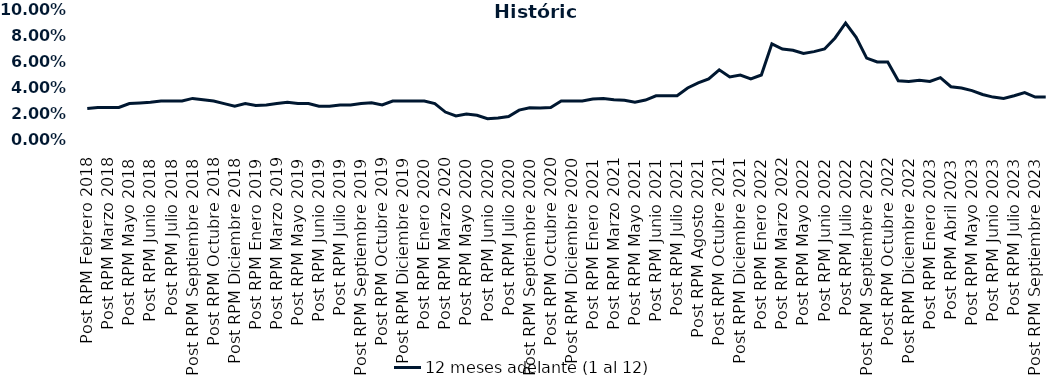
| Category | 12 meses adelante (1 al 12)  |
|---|---|
| Post RPM Febrero 2018 | 0.024 |
| Pre RPM Marzo 2018 | 0.025 |
| Post RPM Marzo 2018 | 0.025 |
| Pre RPM Mayo 2018 | 0.025 |
| Post RPM Mayo 2018 | 0.028 |
| Pre RPM Junio 2018 | 0.028 |
| Post RPM Junio 2018 | 0.029 |
| Pre RPM Julio 2018 | 0.03 |
| Post RPM Julio 2018 | 0.03 |
| Pre RPM Septiembre 2018 | 0.03 |
| Post RPM Septiembre 2018 | 0.032 |
| Pre RPM Octubre 2018 | 0.031 |
| Post RPM Octubre 2018 | 0.03 |
| Pre RPM Diciembre 2018 | 0.028 |
| Post RPM Diciembre 2018 | 0.026 |
| Pre RPM Enero 2019 | 0.028 |
| Post RPM Enero 2019 | 0.026 |
| Pre RPM Marzo 2019 | 0.027 |
| Post RPM Marzo 2019 | 0.028 |
| Pre RPM Mayo 2019 | 0.029 |
| Post RPM Mayo 2019 | 0.028 |
| Pre RPM Junio 2019 | 0.028 |
| Post RPM Junio 2019 | 0.026 |
| Pre RPM Julio 2019 | 0.026 |
| Post RPM Julio 2019 | 0.027 |
| Pre RPM Septiembre 2019 | 0.027 |
| Post RPM Septiembre 2019 | 0.028 |
| Pre RPM Octubre 2019 | 0.029 |
| Post RPM Octubre 2019 | 0.027 |
| Pre RPM Diciembre 2019 | 0.03 |
| Post RPM Diciembre 2019 | 0.03 |
| Pre RPM Enero 2020 | 0.03 |
| Post RPM Enero 2020 | 0.03 |
| Pre RPM Marzo 2020 | 0.028 |
| Post RPM Marzo 2020 | 0.022 |
| Pre RPM Mayo 2020 | 0.018 |
| Post RPM Mayo 2020 | 0.02 |
| Pre RPM Junio 2020 | 0.019 |
| Post RPM Junio 2020 | 0.016 |
| Pre RPM Julio 2020 | 0.017 |
| Post RPM Julio 2020 | 0.018 |
| Pre RPM Septiembre 2020 | 0.023 |
| Post RPM Septiembre 2020 | 0.025 |
| Pre RPM Octubre 2020 | 0.025 |
| Post RPM Octubre 2020 | 0.025 |
| Pre RPM Diciembre 2020 | 0.03 |
| Post RPM Diciembre 2020 | 0.03 |
| Pre RPM Enero 2021 | 0.03 |
| Post RPM Enero 2021 | 0.032 |
| Pre RPM Marzo 2021 | 0.032 |
| Post RPM Marzo 2021 | 0.031 |
| Pre RPM Mayo 2021 | 0.03 |
| Post RPM Mayo 2021 | 0.029 |
| Pre RPM Junio 2021 | 0.031 |
| Post RPM Junio 2021 | 0.034 |
| Pre RPM Julio 2021 | 0.034 |
| Post RPM Julio 2021 | 0.034 |
| Pre RPM Agosto 2021 | 0.04 |
| Post RPM Agosto 2021 | 0.044 |
| Pre RPM Octubre 2021 | 0.047 |
| Post RPM Octubre 2021 | 0.054 |
| Pre RPM Diciembre 2021 | 0.048 |
| Post RPM Diciembre 2021 | 0.05 |
| Pre RPM Enero 2022 | 0.047 |
| Post RPM Enero 2022 | 0.05 |
| Pre RPM Marzo 2022 | 0.074 |
| Post RPM Marzo 2022 | 0.07 |
| Pre RPM Mayo 2022 | 0.069 |
| Post RPM Mayo 2022 | 0.066 |
| Pre RPM Junio 2022 | 0.068 |
| Post RPM Junio 2022 | 0.07 |
| Pre RPM Julio 2022 | 0.078 |
| Post RPM Julio 2022 | 0.09 |
| Pre RPM Septiembre 2022 | 0.079 |
| Post RPM Septiembre 2022 | 0.063 |
| Pre RPM Octubre 2022 | 0.06 |
| Post RPM Octubre 2022 | 0.06 |
| Pre RPM Diciembre 2022 | 0.046 |
| Post RPM Diciembre 2022 | 0.045 |
| Pre RPM Enero 2023 | 0.046 |
| Post RPM Enero 2023 | 0.045 |
| Pre RPM Abril 2023 | 0.048 |
| Post RPM Abril 2023 | 0.041 |
| Pre RPM Mayo 2023 | 0.04 |
| Post RPM Mayo 2023 | 0.038 |
| Pre RPM Junio 2023 | 0.035 |
| Post RPM Junio 2023 | 0.033 |
| Pre RPM Julio 2023 | 0.032 |
| Post RPM Julio 2023 | 0.034 |
| Pre RPM Septiembre 2023 | 0.036 |
| Post RPM Septiembre 2023 | 0.033 |
| Pre RPM Octubre 2023 | 0.033 |